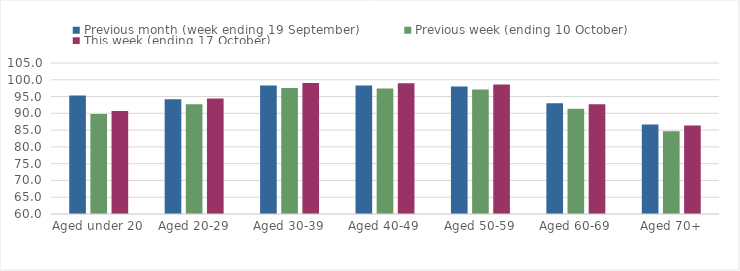
| Category | Previous month (week ending 19 September) | Previous week (ending 10 October) | This week (ending 17 October) |
|---|---|---|---|
| Aged under 20 | 95.33 | 89.77 | 90.67 |
| Aged 20-29 | 94.21 | 92.69 | 94.41 |
| Aged 30-39 | 98.31 | 97.57 | 99.07 |
| Aged 40-49 | 98.31 | 97.37 | 98.94 |
| Aged 50-59 | 97.98 | 97.07 | 98.58 |
| Aged 60-69 | 93.01 | 91.39 | 92.74 |
| Aged 70+ | 86.67 | 84.67 | 86.36 |